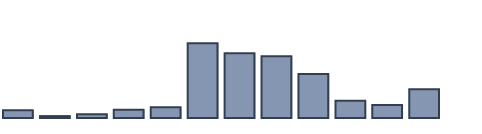
| Category | Series 0 |
|---|---|
| 0 | 2.264 |
| 1 | 0.565 |
| 2 | 1.115 |
| 3 | 2.471 |
| 4 | 3.218 |
| 5 | 22.207 |
| 6 | 19.226 |
| 7 | 18.322 |
| 8 | 13.066 |
| 9 | 5.128 |
| 10 | 3.88 |
| 11 | 8.537 |
| 12 | 0 |